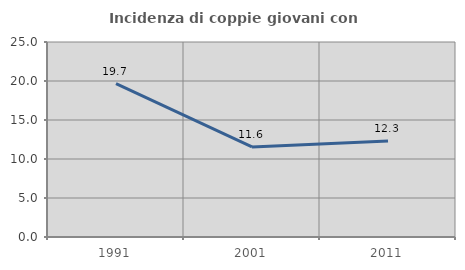
| Category | Incidenza di coppie giovani con figli |
|---|---|
| 1991.0 | 19.668 |
| 2001.0 | 11.553 |
| 2011.0 | 12.303 |